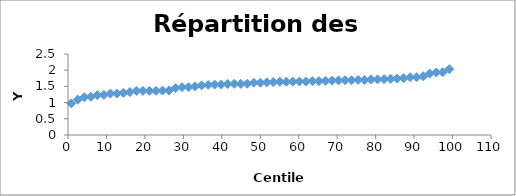
| Category | Series 0 |
|---|---|
| 0.847457627118644 | 0.978 |
| 2.542372881355932 | 1.093 |
| 4.23728813559322 | 1.164 |
| 5.932203389830509 | 1.182 |
| 7.627118644067796 | 1.23 |
| 9.322033898305083 | 1.236 |
| 11.016949152542372 | 1.279 |
| 12.711864406779661 | 1.279 |
| 14.406779661016948 | 1.301 |
| 16.101694915254235 | 1.326 |
| 17.796610169491522 | 1.362 |
| 19.491525423728813 | 1.362 |
| 21.1864406779661 | 1.362 |
| 22.881355932203387 | 1.362 |
| 24.576271186440678 | 1.371 |
| 26.271186440677965 | 1.373 |
| 27.966101694915253 | 1.447 |
| 29.66101694915254 | 1.477 |
| 31.355932203389827 | 1.477 |
| 33.050847457627114 | 1.5 |
| 34.7457627118644 | 1.531 |
| 36.440677966101696 | 1.547 |
| 38.13559322033898 | 1.556 |
| 39.83050847457627 | 1.559 |
| 41.52542372881356 | 1.574 |
| 43.220338983050844 | 1.58 |
| 44.91525423728813 | 1.58 |
| 46.61016949152542 | 1.584 |
| 48.30508474576271 | 1.613 |
| 50.0 | 1.613 |
| 51.69491525423729 | 1.625 |
| 53.389830508474574 | 1.633 |
| 55.08474576271186 | 1.643 |
| 56.77966101694915 | 1.643 |
| 58.474576271186436 | 1.645 |
| 60.16949152542372 | 1.653 |
| 61.86440677966101 | 1.653 |
| 63.559322033898304 | 1.663 |
| 65.25423728813558 | 1.663 |
| 66.94915254237287 | 1.672 |
| 68.64406779661016 | 1.678 |
| 70.33898305084746 | 1.683 |
| 72.03389830508475 | 1.69 |
| 73.72881355932203 | 1.69 |
| 75.42372881355932 | 1.699 |
| 77.11864406779661 | 1.699 |
| 78.8135593220339 | 1.715 |
| 80.50847457627118 | 1.716 |
| 82.20338983050847 | 1.724 |
| 83.89830508474576 | 1.733 |
| 85.59322033898304 | 1.74 |
| 87.28813559322033 | 1.756 |
| 88.98305084745762 | 1.784 |
| 90.6779661016949 | 1.785 |
| 92.3728813559322 | 1.813 |
| 94.06779661016948 | 1.898 |
| 95.76271186440678 | 1.929 |
| 97.45762711864407 | 1.94 |
| 99.15254237288136 | 2.033 |